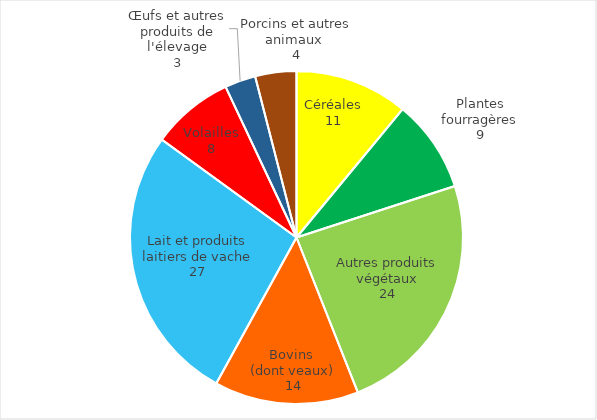
| Category | Series 0 |
|---|---|
| Céréales | 11 |
| Plantes fourragères | 9 |
| Autres produits végétaux | 24 |
| Bovins 
(dont veaux) | 14 |
| Lait et produits laitiers de vache | 27 |
| Volailles | 8 |
| Œufs et autres produits de l'élevage | 3 |
| Porcins et autres animaux  | 4 |